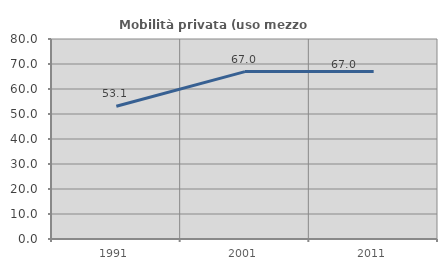
| Category | Mobilità privata (uso mezzo privato) |
|---|---|
| 1991.0 | 53.078 |
| 2001.0 | 66.964 |
| 2011.0 | 66.991 |